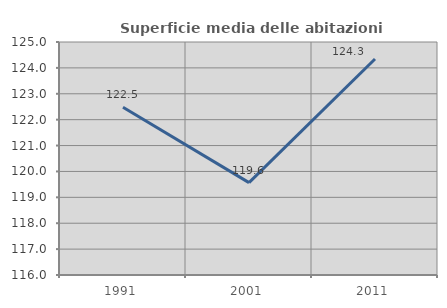
| Category | Superficie media delle abitazioni occupate |
|---|---|
| 1991.0 | 122.476 |
| 2001.0 | 119.568 |
| 2011.0 | 124.343 |